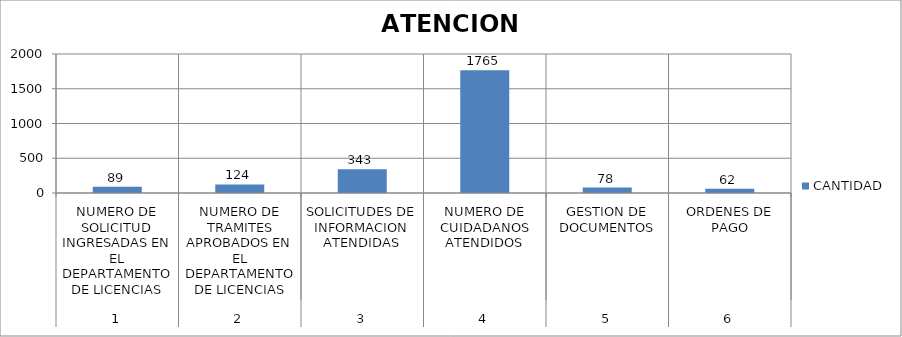
| Category | CANTIDAD |
|---|---|
| 0 | 89 |
| 1 | 124 |
| 2 | 343 |
| 3 | 1765 |
| 4 | 78 |
| 5 | 62 |